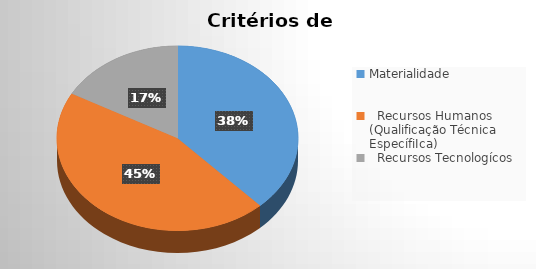
| Category | Series 1 | Series 0 |
|---|---|---|
| Materialidade | 0.38 | 0.38 |
|   Recursos Humanos
(Qualificação Técnica EspecífiIca) | 0.45 | 0.45 |
|   Recursos Tecnologícos  | 0.17 | 0.17 |